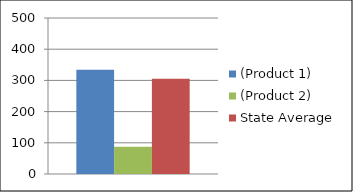
| Category | (Product 1) | (Product 2) | State Average |
|---|---|---|---|
| 0 | 334 | 87 | 305 |